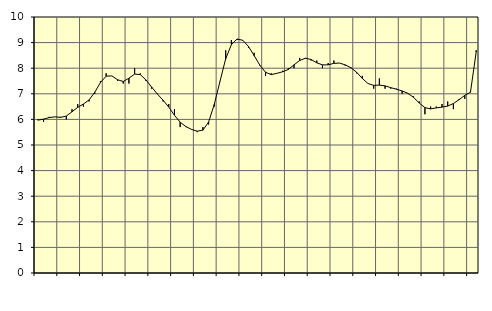
| Category | Piggar | Series 1 |
|---|---|---|
| nan | 6 | 5.97 |
| 1.0 | 5.9 | 6.01 |
| 1.0 | 6.1 | 6.07 |
| 1.0 | 6.1 | 6.1 |
| nan | 6.1 | 6.08 |
| 2.0 | 6 | 6.13 |
| 2.0 | 6.4 | 6.3 |
| 2.0 | 6.6 | 6.47 |
| nan | 6.5 | 6.6 |
| 3.0 | 6.7 | 6.76 |
| 3.0 | 7 | 7.06 |
| 3.0 | 7.5 | 7.44 |
| nan | 7.8 | 7.69 |
| 4.0 | 7.7 | 7.7 |
| 4.0 | 7.5 | 7.55 |
| 4.0 | 7.4 | 7.48 |
| nan | 7.4 | 7.61 |
| 5.0 | 8 | 7.77 |
| 5.0 | 7.8 | 7.75 |
| 5.0 | 7.5 | 7.54 |
| nan | 7.2 | 7.26 |
| 6.0 | 7 | 6.99 |
| 6.0 | 6.7 | 6.75 |
| 6.0 | 6.6 | 6.48 |
| nan | 6.4 | 6.16 |
| 7.0 | 5.7 | 5.89 |
| 7.0 | 5.7 | 5.72 |
| 7.0 | 5.6 | 5.61 |
| nan | 5.5 | 5.54 |
| 8.0 | 5.7 | 5.58 |
| 8.0 | 5.8 | 5.9 |
| 8.0 | 6.5 | 6.59 |
| nan | 7.5 | 7.49 |
| 9.0 | 8.7 | 8.37 |
| 9.0 | 9.1 | 8.92 |
| 9.0 | 9.1 | 9.14 |
| nan | 9.1 | 9.09 |
| 10.0 | 8.8 | 8.85 |
| 10.0 | 8.6 | 8.49 |
| 10.0 | 8.1 | 8.12 |
| nan | 7.7 | 7.84 |
| 11.0 | 7.8 | 7.75 |
| 11.0 | 7.8 | 7.8 |
| 11.0 | 7.9 | 7.86 |
| nan | 8 | 7.95 |
| 12.0 | 8 | 8.13 |
| 12.0 | 8.4 | 8.3 |
| 12.0 | 8.4 | 8.39 |
| nan | 8.3 | 8.34 |
| 13.0 | 8.3 | 8.21 |
| 13.0 | 8 | 8.13 |
| 13.0 | 8.2 | 8.13 |
| nan | 8.3 | 8.19 |
| 14.0 | 8.2 | 8.2 |
| 14.0 | 8.1 | 8.13 |
| 14.0 | 8 | 8.02 |
| nan | 7.8 | 7.84 |
| 15.0 | 7.7 | 7.6 |
| 15.0 | 7.4 | 7.4 |
| 15.0 | 7.2 | 7.33 |
| nan | 7.6 | 7.34 |
| 16.0 | 7.2 | 7.31 |
| 16.0 | 7.2 | 7.24 |
| 16.0 | 7.2 | 7.18 |
| nan | 7 | 7.11 |
| 17.0 | 7 | 7.02 |
| 17.0 | 6.9 | 6.86 |
| 17.0 | 6.7 | 6.64 |
| nan | 6.2 | 6.46 |
| 18.0 | 6.5 | 6.41 |
| 18.0 | 6.5 | 6.45 |
| 18.0 | 6.6 | 6.48 |
| nan | 6.7 | 6.52 |
| 19.0 | 6.4 | 6.62 |
| 19.0 | 6.8 | 6.77 |
| 19.0 | 6.8 | 6.94 |
| nan | 7.1 | 7.06 |
| 20.0 | 8.7 | 8.62 |